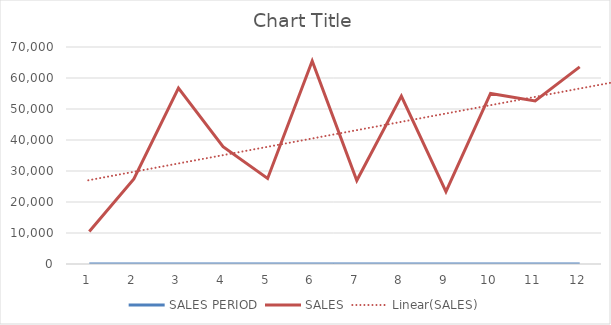
| Category | SALES PERIOD | SALES |
|---|---|---|
| 0 | 1 | 10482 |
| 1 | 2 | 27412 |
| 2 | 3 | 56737 |
| 3 | 4 | 37849 |
| 4 | 5 | 27602 |
| 5 | 6 | 65489 |
| 6 | 7 | 26920 |
| 7 | 8 | 54151 |
| 8 | 9 | 23359 |
| 9 | 10 | 55033 |
| 10 | 11 | 52624 |
| 11 | 12 | 63606 |